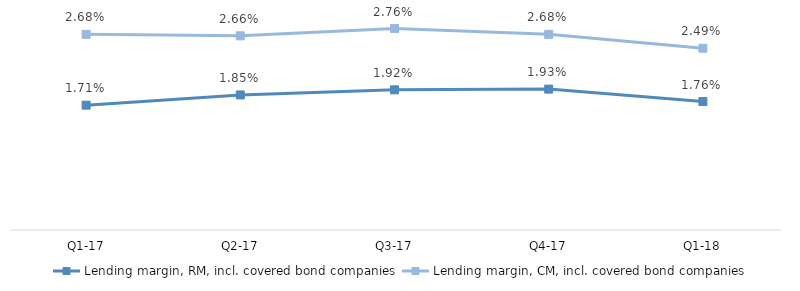
| Category | Lending margin, RM, incl. covered bond companies | Lending margin, CM, incl. covered bond companies |
|---|---|---|
| Q1-18 | 0.018 | 0.025 |
| Q4-17 | 0.019 | 0.027 |
| Q3-17 | 0.019 | 0.028 |
| Q2-17 | 0.018 | 0.027 |
| Q1-17 | 0.017 | 0.027 |